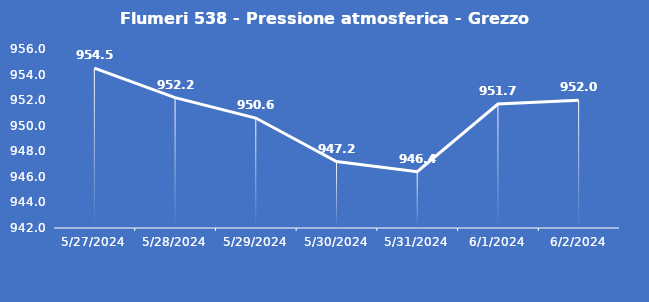
| Category | Flumeri 538 - Pressione atmosferica - Grezzo (hPa) |
|---|---|
| 5/27/24 | 954.5 |
| 5/28/24 | 952.2 |
| 5/29/24 | 950.6 |
| 5/30/24 | 947.2 |
| 5/31/24 | 946.4 |
| 6/1/24 | 951.7 |
| 6/2/24 | 952 |